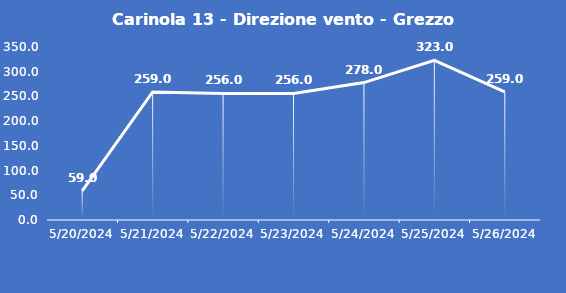
| Category | Carinola 13 - Direzione vento - Grezzo (°N) |
|---|---|
| 5/20/24 | 59 |
| 5/21/24 | 259 |
| 5/22/24 | 256 |
| 5/23/24 | 256 |
| 5/24/24 | 278 |
| 5/25/24 | 323 |
| 5/26/24 | 259 |